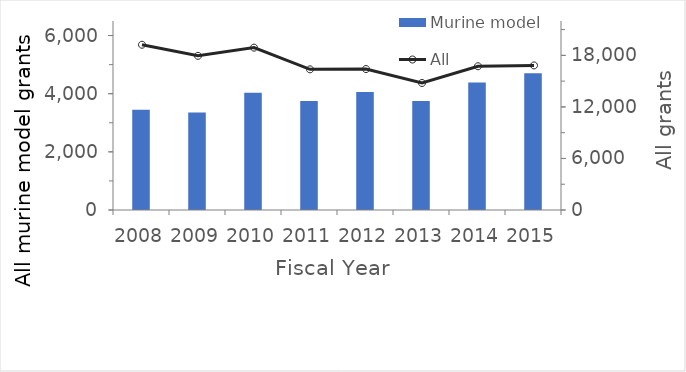
| Category | Murine model |
|---|---|
| 2008.0 | 3451 |
| 2009.0 | 3357 |
| 2010.0 | 4032 |
| 2011.0 | 3751 |
| 2012.0 | 4055 |
| 2013.0 | 3751 |
| 2014.0 | 4384 |
| 2015.0 | 4705 |